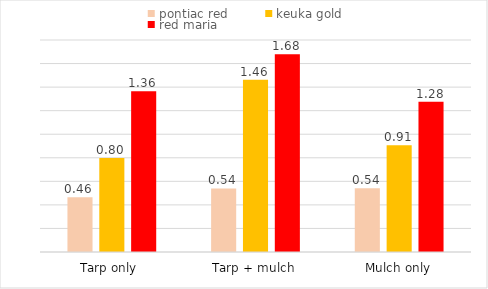
| Category | pontiac red | keuka gold | red maria |
|---|---|---|---|
| Tarp only  | 0.464 | 0.797 | 1.364 |
| Tarp + mulch | 0.54 | 1.463 | 1.678 |
| Mulch only | 0.542 | 0.906 | 1.276 |